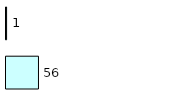
| Category | Series 0 | Series 1 |
|---|---|---|
| 0 | 56 | 1 |